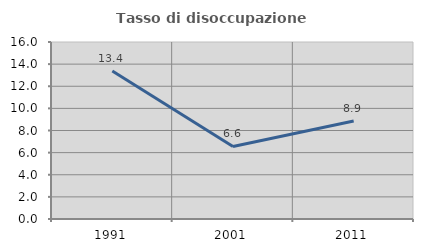
| Category | Tasso di disoccupazione giovanile  |
|---|---|
| 1991.0 | 13.38 |
| 2001.0 | 6.557 |
| 2011.0 | 8.861 |